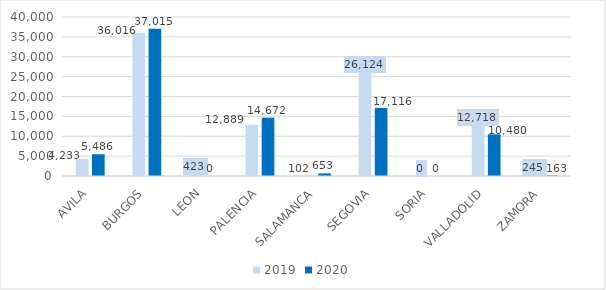
| Category | 2019 | 2020 |
|---|---|---|
| AVILA | 4233.152 | 5486.357 |
| BURGOS | 36015.707 | 37015.279 |
| LEON | 423.034 | 0 |
| PALENCIA | 12889.1 | 14671.603 |
| SALAMANCA | 102.357 | 653.019 |
| SEGOVIA | 26123.931 | 17115.979 |
| SORIA | 0.018 | 0 |
| VALLADOLID | 12717.993 | 10480.462 |
| ZAMORA | 244.853 | 163 |